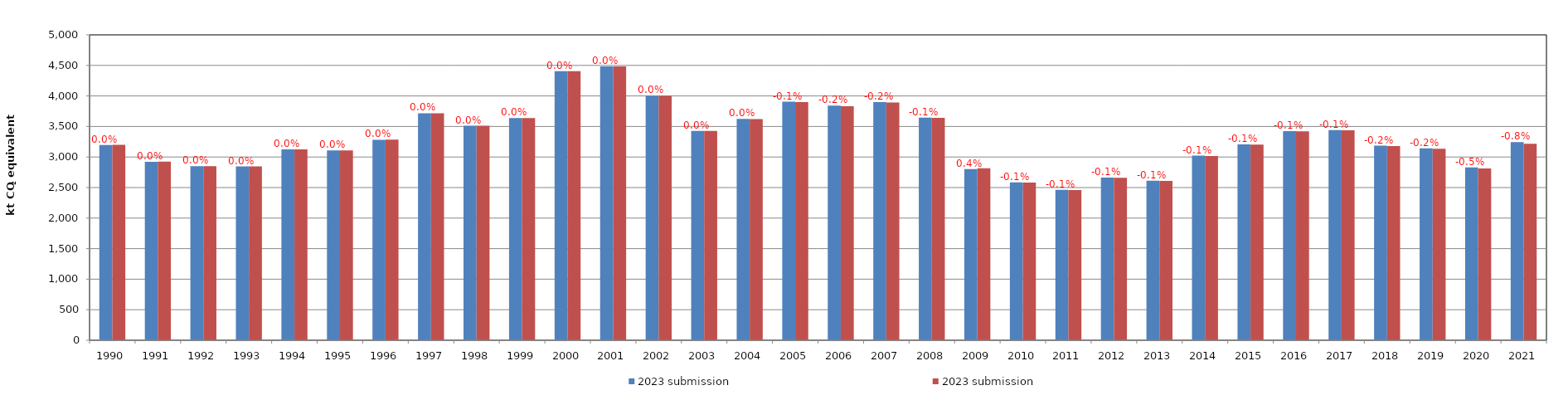
| Category | 2023 submission |
|---|---|
| 1990.0 | 3198.282 |
| 1991.0 | 2923.456 |
| 1992.0 | 2849.147 |
| 1993.0 | 2847.179 |
| 1994.0 | 3124.136 |
| 1995.0 | 3108.117 |
| 1996.0 | 3283.108 |
| 1997.0 | 3717.563 |
| 1998.0 | 3511.646 |
| 1999.0 | 3639.461 |
| 2000.0 | 4407.22 |
| 2001.0 | 4484.589 |
| 2002.0 | 4001.2 |
| 2003.0 | 3425.685 |
| 2004.0 | 3622.057 |
| 2005.0 | 3900.106 |
| 2006.0 | 3831.57 |
| 2007.0 | 3892.178 |
| 2008.0 | 3641.373 |
| 2009.0 | 2815.908 |
| 2010.0 | 2582.76 |
| 2011.0 | 2458.741 |
| 2012.0 | 2659.453 |
| 2013.0 | 2608.149 |
| 2014.0 | 3017.545 |
| 2015.0 | 3201.996 |
| 2016.0 | 3420.728 |
| 2017.0 | 3438.513 |
| 2018.0 | 3180.038 |
| 2019.0 | 3136.438 |
| 2020.0 | 2812.482 |
| 2021.0 | 3216.303 |